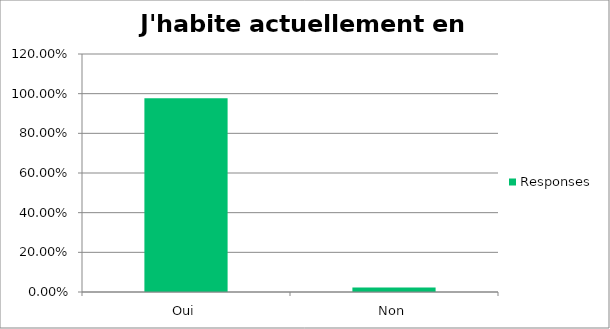
| Category | Responses |
|---|---|
| Oui | 0.977 |
| Non | 0.023 |